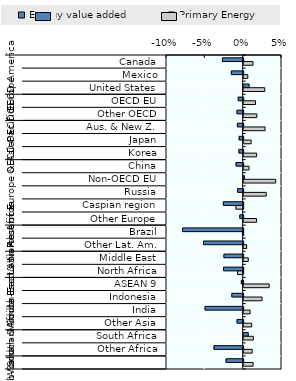
| Category | Energy value added | Primary Energy |
|---|---|---|
| 0 | -0.027 | 0.012 |
| 1 | -0.015 | 0.005 |
| 2 | 0.007 | 0.028 |
| 3 | -0.006 | 0.015 |
| 4 | -0.008 | 0.017 |
| 5 | -0.008 | 0.028 |
| 6 | -0.005 | 0.01 |
| 7 | -0.006 | 0.017 |
| 8 | -0.009 | 0.007 |
| 9 | 0.001 | 0.042 |
| 10 | -0.007 | 0.029 |
| 11 | -0.026 | -0.01 |
| 12 | -0.004 | 0.017 |
| 13 | -0.079 | -0.001 |
| 14 | -0.052 | 0.004 |
| 15 | -0.025 | 0.006 |
| 16 | -0.026 | -0.007 |
| 17 | -0.002 | 0.033 |
| 18 | -0.015 | 0.024 |
| 19 | -0.05 | 0.008 |
| 20 | -0.008 | 0.01 |
| 21 | 0.006 | 0.013 |
| 22 | -0.038 | 0.011 |
| 23 | -0.022 | 0.012 |